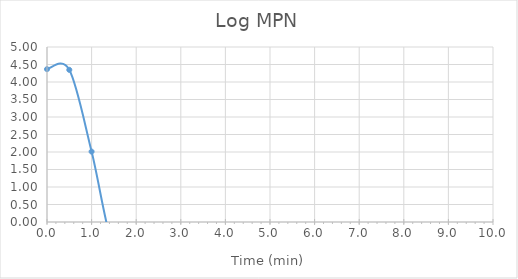
| Category | Series 0 |
|---|---|
| 0.0 | 4.367 |
| 0.5 | 4.347 |
| 1.0 | 2.011 |
| 1.5 | -0.793 |
| 2.0 | -1.012 |
| 2.5 | -1.012 |
| 3.0 | -1.012 |
| 3.5 | -1.012 |
| 4.0 | -1.012 |
| 4.5 | -1.012 |
| 5.0 | -1.012 |
| 5.5 | -1.012 |
| 6.0 | -1.012 |
| 6.5 | -1.012 |
| 7.0 | -1.012 |
| 7.5 | -1.012 |
| 8.0 | -1.012 |
| 8.5 | -1.012 |
| 9.0 | -1.012 |
| 9.5 | -1.012 |
| 10.0 | -1.012 |